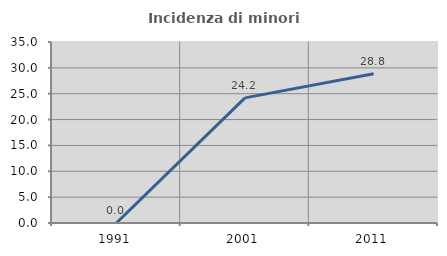
| Category | Incidenza di minori stranieri |
|---|---|
| 1991.0 | 0 |
| 2001.0 | 24.194 |
| 2011.0 | 28.846 |